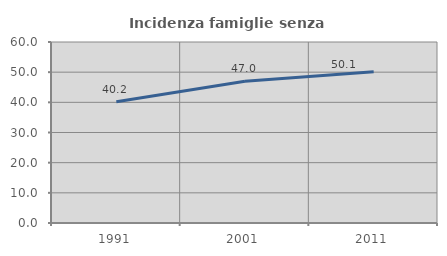
| Category | Incidenza famiglie senza nuclei |
|---|---|
| 1991.0 | 40.196 |
| 2001.0 | 47.018 |
| 2011.0 | 50.116 |